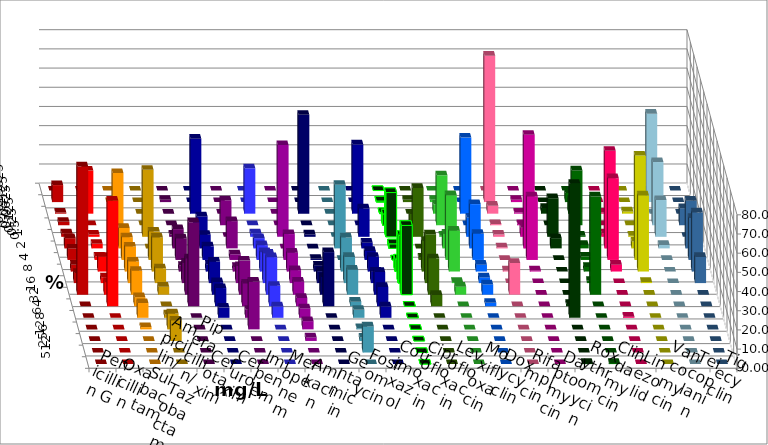
| Category | Penicillin G | Oxacillin | Ampicillin/ Sulbactam | Piperacillin/ Tazobactam | Cefotaxim | Cefuroxim | Imipenem | Meropenem | Amikacin | Gentamicin | Fosfomycin | Cotrimoxazol | Ciprofloxacin | Levofloxacin | Moxifloxacin | Doxycyclin | Rifampicin | Daptomycin | Roxythromycin | Clindamycin | Linezolid | Vancomycin | Teicoplanin | Tigecyclin |
|---|---|---|---|---|---|---|---|---|---|---|---|---|---|---|---|---|---|---|---|---|---|---|---|---|
| 0.015625 | 0 | 0 | 0 | 0 | 0 | 0 | 0 | 0 | 0 | 0 | 0 | 0 | 0 | 0 | 0 | 0 | 0 | 0 | 0 | 0 | 0 | 0 | 0 | 0 |
| 0.03125 | 8.876 | 0 | 0 | 0 | 1.183 | 0 | 0 | 0 | 0 | 0 | 0 | 0 | 0.592 | 1.183 | 1.183 | 0 | 76.331 | 1.183 | 0 | 4.762 | 0 | 0 | 0 | 46.108 |
| 0.0625 | 0.592 | 22.485 | 0 | 0 | 0 | 0 | 39.053 | 23.669 | 0 | 51.534 | 0 | 36.095 | 0.592 | 0 | 4.734 | 39.645 | 4.142 | 0.592 | 2.959 | 7.143 | 0.592 | 1.183 | 0 | 0 |
| 0.125 | 1.775 | 0 | 27.219 | 0 | 0 | 13.018 | 0 | 0 | 0 | 0 | 0 | 0 | 5.917 | 5.917 | 26.036 | 0 | 0.592 | 0.592 | 0 | 28.571 | 0 | 0 | 8.876 | 32.934 |
| 0.25 | 1.775 | 1.183 | 0 | 34.911 | 1.183 | 0 | 10.651 | 1.775 | 47.853 | 1.227 | 0 | 14.793 | 23.077 | 25.444 | 0.592 | 10.059 | 1.183 | 4.734 | 20.118 | 0.595 | 1.775 | 0.592 | 0 | 19.162 |
| 0.5 | 5.325 | 2.367 | 10.651 | 0 | 10.059 | 14.201 | 7.101 | 5.325 | 0 | 0 | 33.136 | 2.959 | 2.367 | 0 | 7.692 | 23.077 | 0.592 | 59.172 | 5.325 | 1.786 | 50.888 | 3.55 | 24.852 | 1.796 |
| 1.0 | 5.917 | 1.775 | 11.834 | 14.793 | 11.243 | 2.959 | 7.101 | 7.692 | 13.497 | 0.613 | 0 | 4.734 | 0 | 1.183 | 33.728 | 13.609 | 0 | 33.136 | 0 | 1.786 | 42.604 | 54.438 | 21.893 | 0 |
| 2.0 | 3.55 | 7.692 | 13.018 | 17.751 | 2.959 | 2.367 | 3.55 | 10.059 | 9.816 | 3.067 | 17.751 | 7.692 | 6.509 | 15.976 | 21.302 | 3.55 | 0.592 | 0.592 | 0 | 2.381 | 3.55 | 39.645 | 30.769 | 0 |
| 4.0 | 5.325 | 2.959 | 11.243 | 7.692 | 10.651 | 8.876 | 11.243 | 15.385 | 6.748 | 6.135 | 13.609 | 5.917 | 24.852 | 25.444 | 0.592 | 2.959 | 0 | 0 | 0 | 1.19 | 0 | 0.592 | 13.609 | 0 |
| 8.0 | 66.864 | 6.509 | 12.426 | 4.142 | 18.935 | 17.751 | 6.509 | 19.527 | 6.748 | 9.202 | 13.018 | 11.834 | 36.095 | 18.935 | 4.142 | 5.325 | 16.568 | 0 | 0 | 51.19 | 0 | 0 | 0 | 0 |
| 16.0 | 0 | 55.03 | 4.734 | 0 | 43.787 | 11.834 | 9.467 | 10.651 | 4.294 | 28.221 | 2.367 | 10.059 | 0 | 5.917 | 0 | 1.775 | 0 | 0 | 1.183 | 0 | 0 | 0 | 0 | 0 |
| 32.0 | 0 | 0 | 7.692 | 1.775 | 0 | 4.142 | 5.325 | 5.917 | 4.908 | 0 | 4.142 | 5.917 | 0 | 0 | 0 | 0 | 0 | 0 | 69.822 | 0 | 0.592 | 0 | 0 | 0 |
| 64.0 | 0 | 0 | 1.183 | 8.284 | 0 | 24.852 | 0 | 0 | 4.294 | 0 | 0.592 | 0 | 0 | 0 | 0 | 0 | 0 | 0 | 0 | 0 | 0 | 0 | 0 | 0 |
| 128.0 | 0 | 0 | 0 | 10.651 | 0 | 0 | 0 | 0 | 1.84 | 0 | 1.775 | 0 | 0 | 0 | 0 | 0 | 0 | 0 | 0 | 0 | 0 | 0 | 0 | 0 |
| 256.0 | 0 | 0 | 0 | 0 | 0 | 0 | 0 | 0 | 0 | 0 | 13.609 | 0 | 0 | 0 | 0 | 0 | 0 | 0 | 0 | 0 | 0 | 0 | 0 | 0 |
| 512.0 | 0 | 0 | 0 | 0 | 0 | 0 | 0 | 0 | 0 | 0 | 0 | 0 | 0 | 0 | 0 | 0 | 0 | 0 | 0.592 | 0.595 | 0 | 0 | 0 | 0 |